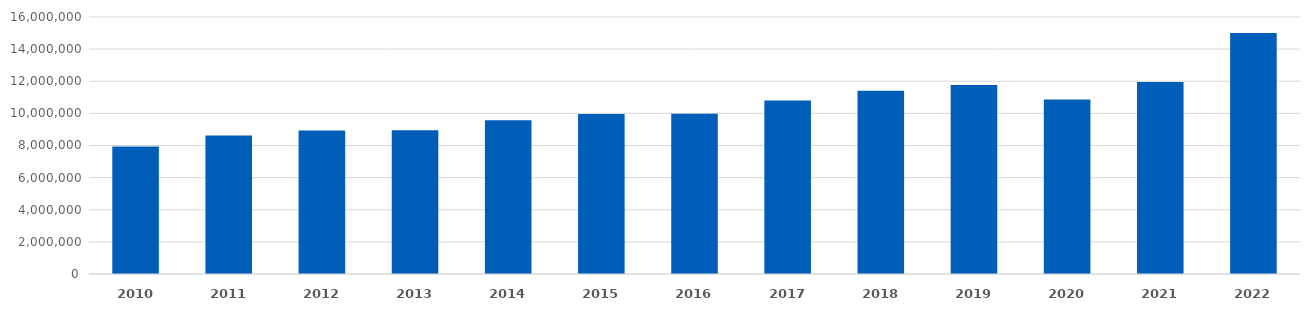
| Category | Celkové tržby vybrané NACE v mil. Kč |
|---|---|
| 2010 | 7943371 |
| 2011 | 8627946 |
| 2012 | 8935809 |
| 2013 | 8952601 |
| 2014 | 9576302 |
| 2015 | 9958330 |
| 2016 | 9980601 |
| 2017 | 10794038 |
| 2018 | 11410376 |
| 2019 | 11768490 |
| 2020 | 10856787 |
| 2021 | 11953884 |
| 2022 | 15000083 |